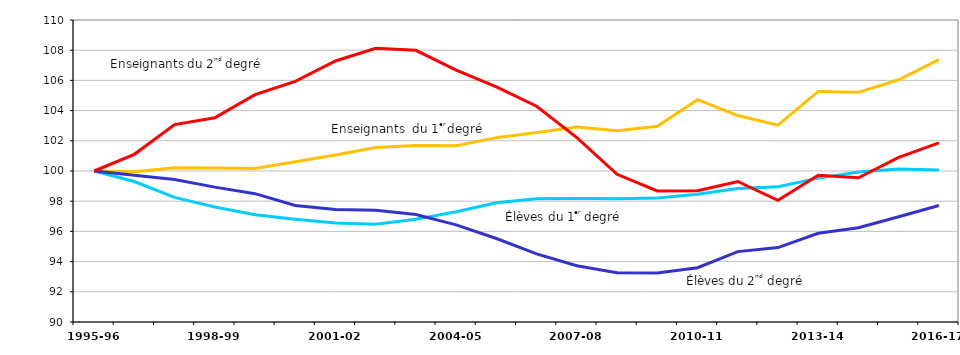
| Category | indice élèves | indice enseignants |
|---|---|---|
| 1995-96 | 100 | 100 |
| 1996-97 | 99.716 | 101.105 |
| 1997-98 | 99.433 | 103.076 |
| 1998-99 | 98.932 | 103.52 |
| 1999-00 | 98.498 | 105.055 |
| 2000-01 | 97.714 | 105.938 |
| 2001-02 | 97.447 | 107.285 |
| 2002-03 | 97.397 | 108.124 |
| 2003-04 | 97.114 | 107.994 |
| 2004-05 | 96.43 | 106.686 |
| 2005-06 | 95.529 | 105.573 |
| 2006-07 | 94.511 | 104.288 |
| 2007-08 | 93.727 | 102.21 |
| 2008-09 | 93.26 | 99.782 |
| 2009-10 | 93.243 | 98.68 |
| 2010-11 | 93.594 | 98.694 |
| 2011-12 | 94.661 | 99.305 |
| 2012-13 | 94.928 | 98.062 |
| 2013-14 | 95.879 | 99.714 |
| 2014-2015 | 96.241 | 99.546 |
| 2015-16 | 96.974 | 100.902 |
| 2016-17 | 97.718 | 101.861 |